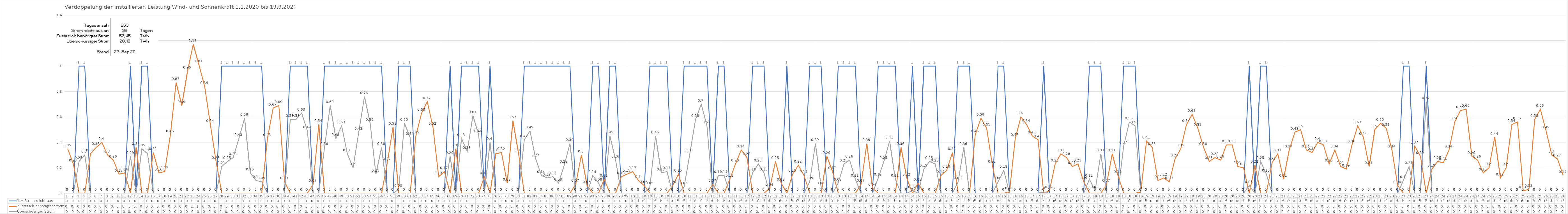
| Category | 1 = Strom reicht aus | Zusätzlich benötigter Strom | Überschüssiger Strom |
|---|---|---|---|
| 0 | 0 | 0.35 | 0 |
| 1 | 0 | 0.23 | 0 |
| 2 | 1 | 0 | 0.25 |
| 3 | 1 | 0 | 0.3 |
| 4 | 0 | 0.31 | 0 |
| 5 | 0 | 0.36 | 0 |
| 6 | 0 | 0.4 | 0 |
| 7 | 0 | 0.3 | 0 |
| 8 | 0 | 0.26 | 0 |
| 9 | 0 | 0.15 | 0 |
| 10 | 0 | 0.16 | 0 |
| 11 | 1 | 0 | 0.29 |
| 12 | 0 | 0.36 | 0 |
| 13 | 1 | 0 | 0.35 |
| 14 | 1 | 0 | 0.31 |
| 15 | 0 | 0.32 | 0 |
| 16 | 0 | 0.16 | 0 |
| 17 | 0 | 0.17 | 0 |
| 18 | 0 | 0.46 | 0 |
| 19 | 0 | 0.87 | 0 |
| 20 | 0 | 0.69 | 0 |
| 21 | 0 | 0.96 | 0 |
| 22 | 0 | 1.17 | 0 |
| 23 | 0 | 1.01 | 0 |
| 24 | 0 | 0.84 | 0 |
| 25 | 0 | 0.54 | 0 |
| 26 | 0 | 0.25 | 0 |
| 27 | 1 | 0 | 0.21 |
| 28 | 1 | 0 | 0.25 |
| 29 | 1 | 0 | 0.28 |
| 30 | 1 | 0 | 0.43 |
| 31 | 1 | 0 | 0.59 |
| 32 | 1 | 0 | 0.16 |
| 33 | 1 | 0 | 0.1 |
| 34 | 1 | 0 | 0.09 |
| 35 | 0 | 0.43 | 0 |
| 36 | 0 | 0.67 | 0 |
| 37 | 0 | 0.69 | 0 |
| 38 | 0 | 0.09 | 0 |
| 39 | 1 | 0 | 0.58 |
| 40 | 1 | 0 | 0.58 |
| 41 | 1 | 0 | 0.63 |
| 42 | 1 | 0 | 0.49 |
| 43 | 0 | 0.07 | 0 |
| 44 | 0 | 0.54 | 0 |
| 45 | 1 | 0 | 0.36 |
| 46 | 1 | 0 | 0.69 |
| 47 | 1 | 0 | 0.43 |
| 48 | 1 | 0 | 0.53 |
| 49 | 1 | 0 | 0.31 |
| 50 | 1 | 0 | 0.2 |
| 51 | 1 | 0 | 0.48 |
| 52 | 1 | 0 | 0.76 |
| 53 | 1 | 0 | 0.55 |
| 54 | 1 | 0 | 0.15 |
| 55 | 1 | 0 | 0.36 |
| 56 | 0 | 0.24 | 0 |
| 57 | 0 | 0.52 | 0 |
| 58 | 1 | 0 | 0.03 |
| 59 | 1 | 0 | 0.55 |
| 60 | 1 | 0 | 0.44 |
| 61 | 0 | 0.45 | 0 |
| 62 | 0 | 0.63 | 0 |
| 63 | 0 | 0.72 | 0 |
| 64 | 0 | 0.52 | 0 |
| 65 | 0 | 0.13 | 0 |
| 66 | 0 | 0.17 | 0 |
| 67 | 1 | 0 | 0.29 |
| 68 | 0 | 0.35 | 0 |
| 69 | 1 | 0 | 0.43 |
| 70 | 1 | 0 | 0.33 |
| 71 | 1 | 0 | 0.61 |
| 72 | 1 | 0 | 0.46 |
| 73 | 0 | 0.13 | 0 |
| 74 | 1 | 0 | 0.4 |
| 75 | 0 | 0.31 | 0 |
| 76 | 0 | 0.32 | 0 |
| 77 | 0 | 0.08 | 0 |
| 78 | 0 | 0.57 | 0 |
| 79 | 0 | 0.31 | 0 |
| 80 | 1 | 0 | 0.42 |
| 81 | 1 | 0 | 0.49 |
| 82 | 1 | 0 | 0.27 |
| 83 | 1 | 0 | 0.14 |
| 84 | 1 | 0 | 0.12 |
| 85 | 1 | 0 | 0.13 |
| 86 | 1 | 0 | 0.08 |
| 87 | 1 | 0 | 0.22 |
| 88 | 1 | 0 | 0.39 |
| 89 | 0 | 0.07 | 0 |
| 90 | 0 | 0.3 | 0 |
| 91 | 0 | 0.06 | 0 |
| 92 | 1 | 0 | 0.14 |
| 93 | 1 | 0 | 0.08 |
| 94 | 0 | 0.11 | 0 |
| 95 | 1 | 0 | 0.45 |
| 96 | 1 | 0 | 0.26 |
| 97 | 0 | 0.13 | 0 |
| 98 | 0 | 0.15 | 0 |
| 99 | 0 | 0.17 | 0 |
| 100 | 0 | 0.1 | 0 |
| 101 | 0 | 0.06 | 0 |
| 102 | 1 | 0 | 0.05 |
| 103 | 1 | 0 | 0.45 |
| 104 | 1 | 0 | 0.16 |
| 105 | 1 | 0 | 0.17 |
| 106 | 0 | 0.06 | 0 |
| 107 | 0 | 0.15 | 0 |
| 108 | 1 | 0 | 0.05 |
| 109 | 1 | 0 | 0.31 |
| 110 | 1 | 0 | 0.58 |
| 111 | 1 | 0 | 0.7 |
| 112 | 1 | 0 | 0.53 |
| 113 | 0 | 0.07 | 0 |
| 114 | 1 | 0 | 0.14 |
| 115 | 1 | 0 | 0.14 |
| 116 | 0 | 0.11 | 0 |
| 117 | 0 | 0.23 | 0 |
| 118 | 0 | 0.34 | 0 |
| 119 | 0 | 0.28 | 0 |
| 120 | 1 | 0 | 0.16 |
| 121 | 1 | 0 | 0.23 |
| 122 | 1 | 0 | 0.16 |
| 123 | 0 | 0.04 | 0 |
| 124 | 0 | 0.25 | 0 |
| 125 | 0 | 0.08 | 0 |
| 126 | 1 | 0 | 0 |
| 127 | 0 | 0.15 | 0 |
| 128 | 0 | 0.22 | 0 |
| 129 | 0 | 0.14 | 0 |
| 130 | 1 | 0 | 0.09 |
| 131 | 1 | 0 | 0.39 |
| 132 | 1 | 0 | 0.05 |
| 133 | 0 | 0.29 | 0 |
| 134 | 0 | 0.17 | 0 |
| 135 | 1 | 0 | 0.08 |
| 136 | 1 | 0 | 0.23 |
| 137 | 1 | 0 | 0.26 |
| 138 | 1 | 0 | 0.11 |
| 139 | 0 | 0.07 | 0 |
| 140 | 0 | 0.39 | 0 |
| 141 | 0 | 0.04 | 0 |
| 142 | 1 | 0 | 0.12 |
| 143 | 1 | 0 | 0.25 |
| 144 | 1 | 0 | 0.41 |
| 145 | 1 | 0 | 0.11 |
| 146 | 0 | 0.36 | 0 |
| 147 | 0 | 0.12 | 0 |
| 148 | 1 | 0 | 0.02 |
| 149 | 0 | 0.08 | 0 |
| 150 | 1 | 0 | 0.19 |
| 151 | 1 | 0 | 0.25 |
| 152 | 1 | 0 | 0.23 |
| 153 | 0 | 0.14 | 0 |
| 154 | 0 | 0.18 | 0 |
| 155 | 0 | 0.32 | 0 |
| 156 | 1 | 0 | 0.09 |
| 157 | 1 | 0 | 0.36 |
| 158 | 1 | 0 | 0 |
| 159 | 0 | 0.46 | 0 |
| 160 | 0 | 0.59 | 0 |
| 161 | 0 | 0.51 | 0 |
| 162 | 0 | 0.22 | 0 |
| 163 | 1 | 0 | 0.09 |
| 164 | 1 | 0 | 0.18 |
| 165 | 0 | 0.01 | 0 |
| 166 | 0 | 0.43 | 0 |
| 167 | 0 | 0.6 | 0 |
| 168 | 0 | 0.54 | 0 |
| 169 | 0 | 0.45 | 0 |
| 170 | 0 | 0.42 | 0 |
| 171 | 1 | 0 | 0.01 |
| 172 | 0 | 0.02 | 0 |
| 173 | 0 | 0.23 | 0 |
| 174 | 0 | 0.31 | 0 |
| 175 | 0 | 0.28 | 0 |
| 176 | 0 | 0.21 | 0 |
| 177 | 0 | 0.23 | 0 |
| 178 | 0 | 0.09 | 0 |
| 179 | 1 | 0 | 0.11 |
| 180 | 1 | 0 | 0.02 |
| 181 | 1 | 0 | 0.31 |
| 182 | 0 | 0.07 | 0 |
| 183 | 0 | 0.31 | 0 |
| 184 | 0 | 0.14 | 0 |
| 185 | 1 | 0 | 0.37 |
| 186 | 1 | 0 | 0.56 |
| 187 | 1 | 0 | 0.53 |
| 188 | 0 | 0.01 | 0 |
| 189 | 0 | 0.41 | 0 |
| 190 | 0 | 0.36 | 0 |
| 191 | 0 | 0.1 | 0 |
| 192 | 0 | 0.12 | 0 |
| 193 | 0 | 0.09 | 0 |
| 194 | 0 | 0.27 | 0 |
| 195 | 0 | 0.35 | 0 |
| 196 | 0 | 0.54 | 0 |
| 197 | 0 | 0.62 | 0 |
| 198 | 0 | 0.51 | 0 |
| 199 | 0 | 0.36 | 0 |
| 200 | 0 | 0.25 | 0 |
| 201 | 0 | 0.28 | 0 |
| 202 | 0 | 0.26 | 0 |
| 203 | 0 | 0.38 | 0 |
| 204 | 0 | 0.38 | 0 |
| 205 | 0 | 0.21 | 0 |
| 206 | 0 | 0.2 | 0 |
| 207 | 1 | 0 | 0.06 |
| 208 | 0 | 0.22 | 0 |
| 209 | 1 | 0 | 0.25 |
| 210 | 1 | 0 | 0.15 |
| 211 | 0 | 0.24 | 0 |
| 212 | 0 | 0.31 | 0 |
| 213 | 0 | 0.11 | 0 |
| 214 | 0 | 0.34 | 0 |
| 215 | 0 | 0.48 | 0 |
| 216 | 0 | 0.5 | 0 |
| 217 | 0 | 0.34 | 0 |
| 218 | 0 | 0.32 | 0 |
| 219 | 0 | 0.4 | 0 |
| 220 | 0 | 0.38 | 0 |
| 221 | 0 | 0.23 | 0 |
| 222 | 0 | 0.34 | 0 |
| 223 | 0 | 0.21 | 0 |
| 224 | 0 | 0.19 | 0 |
| 225 | 0 | 0.38 | 0 |
| 226 | 0 | 0.53 | 0 |
| 227 | 0 | 0.44 | 0 |
| 228 | 0 | 0.21 | 0 |
| 229 | 0 | 0.5 | 0 |
| 230 | 0 | 0.55 | 0 |
| 231 | 0 | 0.51 | 0 |
| 232 | 0 | 0.34 | 0 |
| 233 | 0 | 0.06 | 0 |
| 234 | 1 | 0 | 0.1 |
| 235 | 1 | 0 | 0.21 |
| 236 | 0 | 0.37 | 0 |
| 237 | 0 | 0.29 | 0 |
| 238 | 1 | 0 | 0.72 |
| 239 | 0 | 0.19 | 0 |
| 240 | 0 | 0.25 | 0 |
| 241 | 0 | 0.24 | 0 |
| 242 | 0 | 0.34 | 0 |
| 243 | 0 | 0.56 | 0 |
| 244 | 0 | 0.65 | 0 |
| 245 | 0 | 0.66 | 0 |
| 246 | 0 | 0.29 | 0 |
| 247 | 0 | 0.26 | 0 |
| 248 | 0 | 0.16 | 0 |
| 249 | 0 | 0.2 | 0 |
| 250 | 0 | 0.44 | 0 |
| 251 | 0 | 0.12 | 0 |
| 252 | 0 | 0.2 | 0 |
| 253 | 0 | 0.54 | 0 |
| 254 | 0 | 0.56 | 0 |
| 255 | 0 | 0.02 | 0 |
| 256 | 0 | 0.03 | 0 |
| 257 | 0 | 0.58 | 0 |
| 258 | 0 | 0.66 | 0 |
| 259 | 0 | 0.49 | 0 |
| 260 | 0 | 0.3 | 0 |
| 261 | 0 | 0.27 | 0 |
| 262 | 0 | 0.14 | 0 |